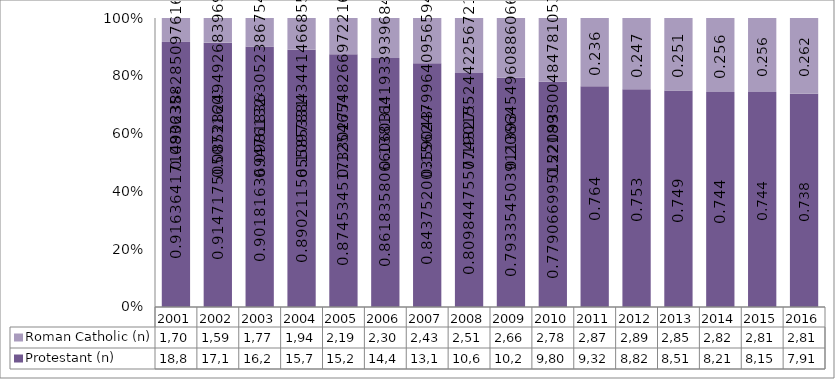
| Category | Protestant (n) | Roman Catholic (n) |
|---|---|---|
| 2001.0 | 18861 | 1705 |
| 2002.0 | 17129 | 1597 |
| 2003.0 | 16285 | 1773 |
| 2004.0 | 15779 | 1946 |
| 2005.0 | 15265 | 2190 |
| 2006.0 | 14403 | 2309 |
| 2007.0 | 13160 | 2437 |
| 2008.0 | 10694 | 2511 |
| 2009.0 | 10243 | 2668 |
| 2010.0 | 9803 | 2780 |
| 2011.0 | 9322 | 2879 |
| 2012.0 | 8825 | 2894 |
| 2013.0 | 8518 | 2852 |
| 2014.0 | 8218 | 2829 |
| 2015.0 | 8153 | 2811 |
| 2016.0 | 7918 | 2818 |